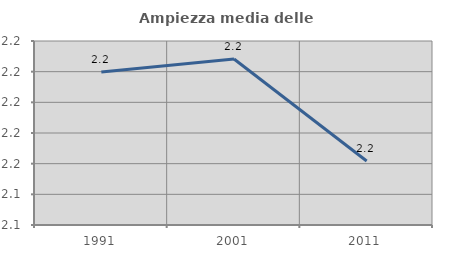
| Category | Ampiezza media delle famiglie |
|---|---|
| 1991.0 | 2.22 |
| 2001.0 | 2.228 |
| 2011.0 | 2.162 |